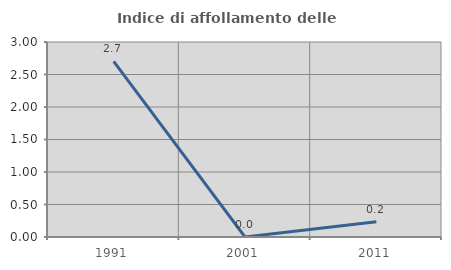
| Category | Indice di affollamento delle abitazioni  |
|---|---|
| 1991.0 | 2.703 |
| 2001.0 | 0 |
| 2011.0 | 0.235 |